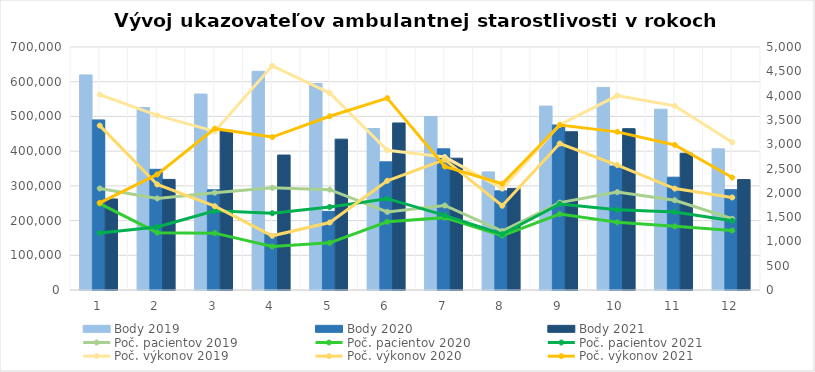
| Category | Body 2019 | Body 2020 | Body 2021 |
|---|---|---|---|
| 0 | 619635 | 490005 | 262210 |
| 1 | 525620 | 347659 | 318590 |
| 2 | 564470 | 288795 | 460105 |
| 3 | 630025 | 160865 | 388690 |
| 4 | 594610 | 226520 | 434560 |
| 5 | 465189 | 369175 | 481090 |
| 6 | 499715 | 406685 | 379695 |
| 7 | 340240 | 285679 | 292620 |
| 8 | 529740 | 475355 | 455845 |
| 9 | 583661 | 357100 | 464760 |
| 10 | 520690 | 324950 | 394065 |
| 11 | 406690 | 288995 | 317960 |